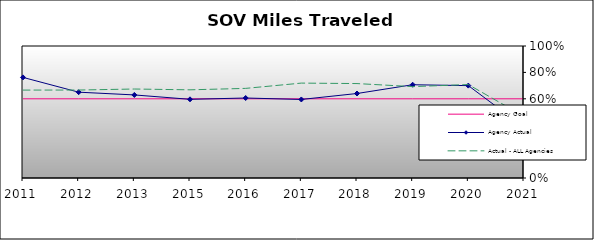
| Category | Agency Goal | Agency Actual | Actual - ALL Agencies |
|---|---|---|---|
| 2011.0 | 0.6 | 0.762 | 0.666 |
| 2012.0 | 0.6 | 0.65 | 0.666 |
| 2013.0 | 0.6 | 0.629 | 0.674 |
| 2015.0 | 0.6 | 0.596 | 0.668 |
| 2016.0 | 0.6 | 0.606 | 0.679 |
| 2017.0 | 0.6 | 0.595 | 0.719 |
| 2018.0 | 0.6 | 0.64 | 0.715 |
| 2019.0 | 0.6 | 0.706 | 0.692 |
| 2020.0 | 0.6 | 0.7 | 0.708 |
| 2021.0 | 0.6 | 0.385 | 0.467 |